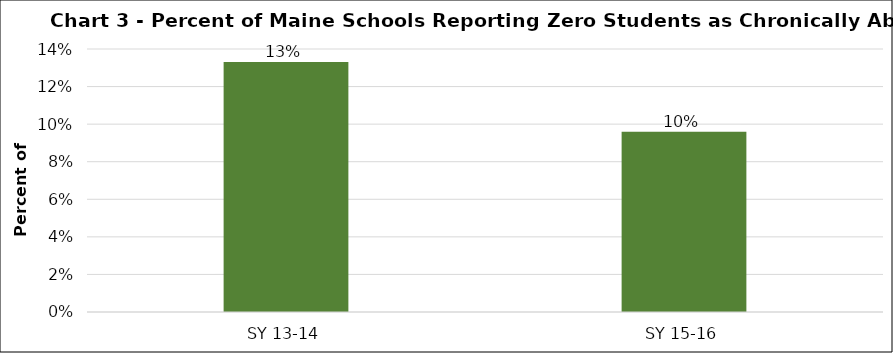
| Category | Series 0 |
|---|---|
| SY 13-14 | 0.133 |
| SY 15-16 | 0.096 |